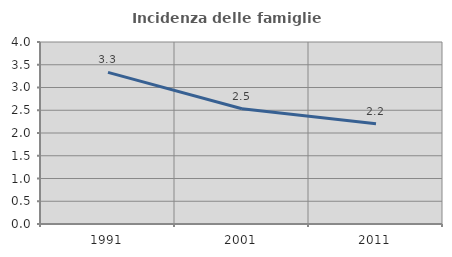
| Category | Incidenza delle famiglie numerose |
|---|---|
| 1991.0 | 3.333 |
| 2001.0 | 2.535 |
| 2011.0 | 2.204 |